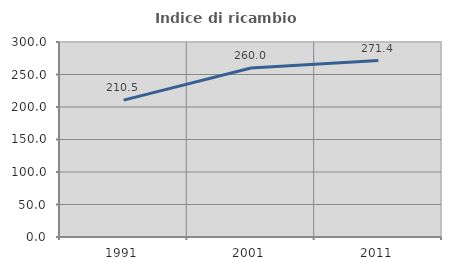
| Category | Indice di ricambio occupazionale  |
|---|---|
| 1991.0 | 210.526 |
| 2001.0 | 260 |
| 2011.0 | 271.429 |